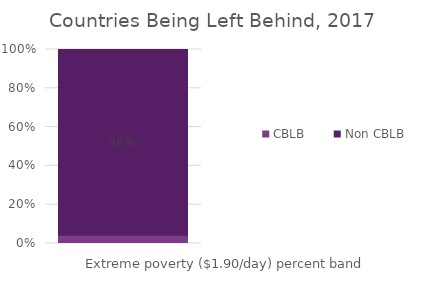
| Category | CBLB | Non CBLB |
|---|---|---|
| 0 | 0.042 | 0.958 |